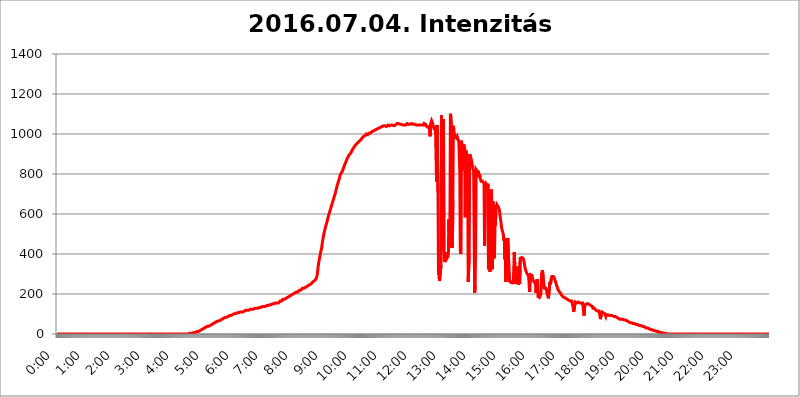
| Category | 2016.07.04. Intenzitás [W/m^2] |
|---|---|
| 0.0 | 0 |
| 0.0006944444444444445 | 0 |
| 0.001388888888888889 | 0 |
| 0.0020833333333333333 | 0 |
| 0.002777777777777778 | 0 |
| 0.003472222222222222 | 0 |
| 0.004166666666666667 | 0 |
| 0.004861111111111111 | 0 |
| 0.005555555555555556 | 0 |
| 0.0062499999999999995 | 0 |
| 0.006944444444444444 | 0 |
| 0.007638888888888889 | 0 |
| 0.008333333333333333 | 0 |
| 0.009027777777777779 | 0 |
| 0.009722222222222222 | 0 |
| 0.010416666666666666 | 0 |
| 0.011111111111111112 | 0 |
| 0.011805555555555555 | 0 |
| 0.012499999999999999 | 0 |
| 0.013194444444444444 | 0 |
| 0.013888888888888888 | 0 |
| 0.014583333333333332 | 0 |
| 0.015277777777777777 | 0 |
| 0.015972222222222224 | 0 |
| 0.016666666666666666 | 0 |
| 0.017361111111111112 | 0 |
| 0.018055555555555557 | 0 |
| 0.01875 | 0 |
| 0.019444444444444445 | 0 |
| 0.02013888888888889 | 0 |
| 0.020833333333333332 | 0 |
| 0.02152777777777778 | 0 |
| 0.022222222222222223 | 0 |
| 0.02291666666666667 | 0 |
| 0.02361111111111111 | 0 |
| 0.024305555555555556 | 0 |
| 0.024999999999999998 | 0 |
| 0.025694444444444447 | 0 |
| 0.02638888888888889 | 0 |
| 0.027083333333333334 | 0 |
| 0.027777777777777776 | 0 |
| 0.02847222222222222 | 0 |
| 0.029166666666666664 | 0 |
| 0.029861111111111113 | 0 |
| 0.030555555555555555 | 0 |
| 0.03125 | 0 |
| 0.03194444444444445 | 0 |
| 0.03263888888888889 | 0 |
| 0.03333333333333333 | 0 |
| 0.034027777777777775 | 0 |
| 0.034722222222222224 | 0 |
| 0.035416666666666666 | 0 |
| 0.036111111111111115 | 0 |
| 0.03680555555555556 | 0 |
| 0.0375 | 0 |
| 0.03819444444444444 | 0 |
| 0.03888888888888889 | 0 |
| 0.03958333333333333 | 0 |
| 0.04027777777777778 | 0 |
| 0.04097222222222222 | 0 |
| 0.041666666666666664 | 0 |
| 0.042361111111111106 | 0 |
| 0.04305555555555556 | 0 |
| 0.043750000000000004 | 0 |
| 0.044444444444444446 | 0 |
| 0.04513888888888889 | 0 |
| 0.04583333333333334 | 0 |
| 0.04652777777777778 | 0 |
| 0.04722222222222222 | 0 |
| 0.04791666666666666 | 0 |
| 0.04861111111111111 | 0 |
| 0.049305555555555554 | 0 |
| 0.049999999999999996 | 0 |
| 0.05069444444444445 | 0 |
| 0.051388888888888894 | 0 |
| 0.052083333333333336 | 0 |
| 0.05277777777777778 | 0 |
| 0.05347222222222222 | 0 |
| 0.05416666666666667 | 0 |
| 0.05486111111111111 | 0 |
| 0.05555555555555555 | 0 |
| 0.05625 | 0 |
| 0.05694444444444444 | 0 |
| 0.057638888888888885 | 0 |
| 0.05833333333333333 | 0 |
| 0.05902777777777778 | 0 |
| 0.059722222222222225 | 0 |
| 0.06041666666666667 | 0 |
| 0.061111111111111116 | 0 |
| 0.06180555555555556 | 0 |
| 0.0625 | 0 |
| 0.06319444444444444 | 0 |
| 0.06388888888888888 | 0 |
| 0.06458333333333334 | 0 |
| 0.06527777777777778 | 0 |
| 0.06597222222222222 | 0 |
| 0.06666666666666667 | 0 |
| 0.06736111111111111 | 0 |
| 0.06805555555555555 | 0 |
| 0.06874999999999999 | 0 |
| 0.06944444444444443 | 0 |
| 0.07013888888888889 | 0 |
| 0.07083333333333333 | 0 |
| 0.07152777777777779 | 0 |
| 0.07222222222222223 | 0 |
| 0.07291666666666667 | 0 |
| 0.07361111111111111 | 0 |
| 0.07430555555555556 | 0 |
| 0.075 | 0 |
| 0.07569444444444444 | 0 |
| 0.0763888888888889 | 0 |
| 0.07708333333333334 | 0 |
| 0.07777777777777778 | 0 |
| 0.07847222222222222 | 0 |
| 0.07916666666666666 | 0 |
| 0.0798611111111111 | 0 |
| 0.08055555555555556 | 0 |
| 0.08125 | 0 |
| 0.08194444444444444 | 0 |
| 0.08263888888888889 | 0 |
| 0.08333333333333333 | 0 |
| 0.08402777777777777 | 0 |
| 0.08472222222222221 | 0 |
| 0.08541666666666665 | 0 |
| 0.08611111111111112 | 0 |
| 0.08680555555555557 | 0 |
| 0.08750000000000001 | 0 |
| 0.08819444444444445 | 0 |
| 0.08888888888888889 | 0 |
| 0.08958333333333333 | 0 |
| 0.09027777777777778 | 0 |
| 0.09097222222222222 | 0 |
| 0.09166666666666667 | 0 |
| 0.09236111111111112 | 0 |
| 0.09305555555555556 | 0 |
| 0.09375 | 0 |
| 0.09444444444444444 | 0 |
| 0.09513888888888888 | 0 |
| 0.09583333333333333 | 0 |
| 0.09652777777777777 | 0 |
| 0.09722222222222222 | 0 |
| 0.09791666666666667 | 0 |
| 0.09861111111111111 | 0 |
| 0.09930555555555555 | 0 |
| 0.09999999999999999 | 0 |
| 0.10069444444444443 | 0 |
| 0.1013888888888889 | 0 |
| 0.10208333333333335 | 0 |
| 0.10277777777777779 | 0 |
| 0.10347222222222223 | 0 |
| 0.10416666666666667 | 0 |
| 0.10486111111111111 | 0 |
| 0.10555555555555556 | 0 |
| 0.10625 | 0 |
| 0.10694444444444444 | 0 |
| 0.1076388888888889 | 0 |
| 0.10833333333333334 | 0 |
| 0.10902777777777778 | 0 |
| 0.10972222222222222 | 0 |
| 0.1111111111111111 | 0 |
| 0.11180555555555556 | 0 |
| 0.11180555555555556 | 0 |
| 0.1125 | 0 |
| 0.11319444444444444 | 0 |
| 0.11388888888888889 | 0 |
| 0.11458333333333333 | 0 |
| 0.11527777777777777 | 0 |
| 0.11597222222222221 | 0 |
| 0.11666666666666665 | 0 |
| 0.1173611111111111 | 0 |
| 0.11805555555555557 | 0 |
| 0.11944444444444445 | 0 |
| 0.12013888888888889 | 0 |
| 0.12083333333333333 | 0 |
| 0.12152777777777778 | 0 |
| 0.12222222222222223 | 0 |
| 0.12291666666666667 | 0 |
| 0.12291666666666667 | 0 |
| 0.12361111111111112 | 0 |
| 0.12430555555555556 | 0 |
| 0.125 | 0 |
| 0.12569444444444444 | 0 |
| 0.12638888888888888 | 0 |
| 0.12708333333333333 | 0 |
| 0.16875 | 0 |
| 0.12847222222222224 | 0 |
| 0.12916666666666668 | 0 |
| 0.12986111111111112 | 0 |
| 0.13055555555555556 | 0 |
| 0.13125 | 0 |
| 0.13194444444444445 | 0 |
| 0.1326388888888889 | 0 |
| 0.13333333333333333 | 0 |
| 0.13402777777777777 | 0 |
| 0.13402777777777777 | 0 |
| 0.13472222222222222 | 0 |
| 0.13541666666666666 | 0 |
| 0.1361111111111111 | 0 |
| 0.13749999999999998 | 0 |
| 0.13819444444444443 | 0 |
| 0.1388888888888889 | 0 |
| 0.13958333333333334 | 0 |
| 0.14027777777777778 | 0 |
| 0.14097222222222222 | 0 |
| 0.14166666666666666 | 0 |
| 0.1423611111111111 | 0 |
| 0.14305555555555557 | 0 |
| 0.14375000000000002 | 0 |
| 0.14444444444444446 | 0 |
| 0.1451388888888889 | 0 |
| 0.1451388888888889 | 0 |
| 0.14652777777777778 | 0 |
| 0.14722222222222223 | 0 |
| 0.14791666666666667 | 0 |
| 0.1486111111111111 | 0 |
| 0.14930555555555555 | 0 |
| 0.15 | 0 |
| 0.15069444444444444 | 0 |
| 0.15138888888888888 | 0 |
| 0.15208333333333332 | 0 |
| 0.15277777777777776 | 0 |
| 0.15347222222222223 | 0 |
| 0.15416666666666667 | 0 |
| 0.15486111111111112 | 0 |
| 0.15555555555555556 | 0 |
| 0.15625 | 0 |
| 0.15694444444444444 | 0 |
| 0.15763888888888888 | 0 |
| 0.15833333333333333 | 0 |
| 0.15902777777777777 | 0 |
| 0.15972222222222224 | 0 |
| 0.16041666666666668 | 0 |
| 0.16111111111111112 | 0 |
| 0.16180555555555556 | 0 |
| 0.1625 | 0 |
| 0.16319444444444445 | 0 |
| 0.1638888888888889 | 0 |
| 0.16458333333333333 | 0 |
| 0.16527777777777777 | 0 |
| 0.16597222222222222 | 0 |
| 0.16666666666666666 | 0 |
| 0.1673611111111111 | 0 |
| 0.16805555555555554 | 0 |
| 0.16874999999999998 | 0 |
| 0.16944444444444443 | 0 |
| 0.17013888888888887 | 0 |
| 0.1708333333333333 | 0 |
| 0.17152777777777775 | 0 |
| 0.17222222222222225 | 0 |
| 0.1729166666666667 | 0 |
| 0.17361111111111113 | 0 |
| 0.17430555555555557 | 0 |
| 0.17500000000000002 | 0 |
| 0.17569444444444446 | 0 |
| 0.1763888888888889 | 0 |
| 0.17708333333333334 | 0 |
| 0.17777777777777778 | 0 |
| 0.17847222222222223 | 0 |
| 0.17916666666666667 | 0 |
| 0.1798611111111111 | 0 |
| 0.18055555555555555 | 0 |
| 0.18125 | 0 |
| 0.18194444444444444 | 0 |
| 0.1826388888888889 | 0 |
| 0.18333333333333335 | 0 |
| 0.1840277777777778 | 0 |
| 0.18472222222222223 | 0 |
| 0.18541666666666667 | 3.525 |
| 0.18611111111111112 | 3.525 |
| 0.18680555555555556 | 3.525 |
| 0.1875 | 3.525 |
| 0.18819444444444444 | 3.525 |
| 0.18888888888888888 | 3.525 |
| 0.18958333333333333 | 3.525 |
| 0.19027777777777777 | 3.525 |
| 0.1909722222222222 | 3.525 |
| 0.19166666666666665 | 7.887 |
| 0.19236111111111112 | 7.887 |
| 0.19305555555555554 | 7.887 |
| 0.19375 | 7.887 |
| 0.19444444444444445 | 7.887 |
| 0.1951388888888889 | 12.257 |
| 0.19583333333333333 | 12.257 |
| 0.19652777777777777 | 12.257 |
| 0.19722222222222222 | 12.257 |
| 0.19791666666666666 | 12.257 |
| 0.1986111111111111 | 16.636 |
| 0.19930555555555554 | 16.636 |
| 0.19999999999999998 | 16.636 |
| 0.20069444444444443 | 21.024 |
| 0.20138888888888887 | 21.024 |
| 0.2020833333333333 | 21.024 |
| 0.2027777777777778 | 25.419 |
| 0.2034722222222222 | 25.419 |
| 0.2041666666666667 | 25.419 |
| 0.20486111111111113 | 29.823 |
| 0.20555555555555557 | 29.823 |
| 0.20625000000000002 | 29.823 |
| 0.20694444444444446 | 29.823 |
| 0.2076388888888889 | 29.823 |
| 0.20833333333333334 | 34.234 |
| 0.20902777777777778 | 34.234 |
| 0.20972222222222223 | 38.653 |
| 0.21041666666666667 | 38.653 |
| 0.2111111111111111 | 38.653 |
| 0.21180555555555555 | 38.653 |
| 0.2125 | 38.653 |
| 0.21319444444444444 | 43.079 |
| 0.2138888888888889 | 43.079 |
| 0.21458333333333335 | 43.079 |
| 0.2152777777777778 | 47.511 |
| 0.21597222222222223 | 47.511 |
| 0.21666666666666667 | 47.511 |
| 0.21736111111111112 | 47.511 |
| 0.21805555555555556 | 51.951 |
| 0.21875 | 51.951 |
| 0.21944444444444444 | 51.951 |
| 0.22013888888888888 | 56.398 |
| 0.22083333333333333 | 56.398 |
| 0.22152777777777777 | 56.398 |
| 0.2222222222222222 | 56.398 |
| 0.22291666666666665 | 60.85 |
| 0.2236111111111111 | 60.85 |
| 0.22430555555555556 | 60.85 |
| 0.225 | 65.31 |
| 0.22569444444444445 | 65.31 |
| 0.2263888888888889 | 65.31 |
| 0.22708333333333333 | 65.31 |
| 0.22777777777777777 | 69.775 |
| 0.22847222222222222 | 69.775 |
| 0.22916666666666666 | 69.775 |
| 0.2298611111111111 | 74.246 |
| 0.23055555555555554 | 74.246 |
| 0.23124999999999998 | 74.246 |
| 0.23194444444444443 | 74.246 |
| 0.23263888888888887 | 78.722 |
| 0.2333333333333333 | 78.722 |
| 0.2340277777777778 | 78.722 |
| 0.2347222222222222 | 83.205 |
| 0.2354166666666667 | 83.205 |
| 0.23611111111111113 | 83.205 |
| 0.23680555555555557 | 83.205 |
| 0.23750000000000002 | 83.205 |
| 0.23819444444444446 | 87.692 |
| 0.2388888888888889 | 87.692 |
| 0.23958333333333334 | 87.692 |
| 0.24027777777777778 | 87.692 |
| 0.24097222222222223 | 92.184 |
| 0.24166666666666667 | 92.184 |
| 0.2423611111111111 | 92.184 |
| 0.24305555555555555 | 92.184 |
| 0.24375 | 92.184 |
| 0.24444444444444446 | 92.184 |
| 0.24513888888888888 | 96.682 |
| 0.24583333333333335 | 96.682 |
| 0.2465277777777778 | 96.682 |
| 0.24722222222222223 | 96.682 |
| 0.24791666666666667 | 101.184 |
| 0.24861111111111112 | 101.184 |
| 0.24930555555555556 | 101.184 |
| 0.25 | 101.184 |
| 0.25069444444444444 | 101.184 |
| 0.2513888888888889 | 101.184 |
| 0.2520833333333333 | 105.69 |
| 0.25277777777777777 | 105.69 |
| 0.2534722222222222 | 105.69 |
| 0.25416666666666665 | 105.69 |
| 0.2548611111111111 | 105.69 |
| 0.2555555555555556 | 110.201 |
| 0.25625000000000003 | 110.201 |
| 0.2569444444444445 | 110.201 |
| 0.2576388888888889 | 110.201 |
| 0.25833333333333336 | 110.201 |
| 0.2590277777777778 | 110.201 |
| 0.25972222222222224 | 110.201 |
| 0.2604166666666667 | 110.201 |
| 0.2611111111111111 | 114.716 |
| 0.26180555555555557 | 114.716 |
| 0.2625 | 114.716 |
| 0.26319444444444445 | 114.716 |
| 0.2638888888888889 | 114.716 |
| 0.26458333333333334 | 119.235 |
| 0.2652777777777778 | 114.716 |
| 0.2659722222222222 | 119.235 |
| 0.26666666666666666 | 119.235 |
| 0.2673611111111111 | 119.235 |
| 0.26805555555555555 | 119.235 |
| 0.26875 | 119.235 |
| 0.26944444444444443 | 119.235 |
| 0.2701388888888889 | 119.235 |
| 0.2708333333333333 | 123.758 |
| 0.27152777777777776 | 123.758 |
| 0.2722222222222222 | 123.758 |
| 0.27291666666666664 | 123.758 |
| 0.2736111111111111 | 123.758 |
| 0.2743055555555555 | 123.758 |
| 0.27499999999999997 | 123.758 |
| 0.27569444444444446 | 128.284 |
| 0.27638888888888885 | 128.284 |
| 0.27708333333333335 | 128.284 |
| 0.2777777777777778 | 128.284 |
| 0.27847222222222223 | 128.284 |
| 0.2791666666666667 | 128.284 |
| 0.2798611111111111 | 128.284 |
| 0.28055555555555556 | 128.284 |
| 0.28125 | 128.284 |
| 0.28194444444444444 | 132.814 |
| 0.2826388888888889 | 132.814 |
| 0.2833333333333333 | 132.814 |
| 0.28402777777777777 | 132.814 |
| 0.2847222222222222 | 132.814 |
| 0.28541666666666665 | 132.814 |
| 0.28611111111111115 | 137.347 |
| 0.28680555555555554 | 137.347 |
| 0.28750000000000003 | 137.347 |
| 0.2881944444444445 | 137.347 |
| 0.2888888888888889 | 137.347 |
| 0.28958333333333336 | 137.347 |
| 0.2902777777777778 | 137.347 |
| 0.29097222222222224 | 137.347 |
| 0.2916666666666667 | 137.347 |
| 0.2923611111111111 | 141.884 |
| 0.29305555555555557 | 141.884 |
| 0.29375 | 141.884 |
| 0.29444444444444445 | 141.884 |
| 0.2951388888888889 | 141.884 |
| 0.29583333333333334 | 141.884 |
| 0.2965277777777778 | 146.423 |
| 0.2972222222222222 | 146.423 |
| 0.29791666666666666 | 146.423 |
| 0.2986111111111111 | 146.423 |
| 0.29930555555555555 | 146.423 |
| 0.3 | 146.423 |
| 0.30069444444444443 | 146.423 |
| 0.3013888888888889 | 150.964 |
| 0.3020833333333333 | 150.964 |
| 0.30277777777777776 | 150.964 |
| 0.3034722222222222 | 150.964 |
| 0.30416666666666664 | 150.964 |
| 0.3048611111111111 | 150.964 |
| 0.3055555555555555 | 155.509 |
| 0.30624999999999997 | 155.509 |
| 0.3069444444444444 | 155.509 |
| 0.3076388888888889 | 155.509 |
| 0.30833333333333335 | 155.509 |
| 0.3090277777777778 | 155.509 |
| 0.30972222222222223 | 155.509 |
| 0.3104166666666667 | 155.509 |
| 0.3111111111111111 | 160.056 |
| 0.31180555555555556 | 160.056 |
| 0.3125 | 164.605 |
| 0.31319444444444444 | 164.605 |
| 0.3138888888888889 | 164.605 |
| 0.3145833333333333 | 164.605 |
| 0.31527777777777777 | 169.156 |
| 0.3159722222222222 | 169.156 |
| 0.31666666666666665 | 173.709 |
| 0.31736111111111115 | 173.709 |
| 0.31805555555555554 | 173.709 |
| 0.31875000000000003 | 173.709 |
| 0.3194444444444445 | 178.264 |
| 0.3201388888888889 | 178.264 |
| 0.32083333333333336 | 178.264 |
| 0.3215277777777778 | 182.82 |
| 0.32222222222222224 | 182.82 |
| 0.3229166666666667 | 182.82 |
| 0.3236111111111111 | 182.82 |
| 0.32430555555555557 | 187.378 |
| 0.325 | 187.378 |
| 0.32569444444444445 | 187.378 |
| 0.3263888888888889 | 191.937 |
| 0.32708333333333334 | 191.937 |
| 0.3277777777777778 | 191.937 |
| 0.3284722222222222 | 196.497 |
| 0.32916666666666666 | 196.497 |
| 0.3298611111111111 | 196.497 |
| 0.33055555555555555 | 201.058 |
| 0.33125 | 201.058 |
| 0.33194444444444443 | 201.058 |
| 0.3326388888888889 | 201.058 |
| 0.3333333333333333 | 205.62 |
| 0.3340277777777778 | 205.62 |
| 0.3347222222222222 | 205.62 |
| 0.3354166666666667 | 210.182 |
| 0.3361111111111111 | 210.182 |
| 0.3368055555555556 | 210.182 |
| 0.33749999999999997 | 210.182 |
| 0.33819444444444446 | 214.746 |
| 0.33888888888888885 | 214.746 |
| 0.33958333333333335 | 219.309 |
| 0.34027777777777773 | 219.309 |
| 0.34097222222222223 | 219.309 |
| 0.3416666666666666 | 219.309 |
| 0.3423611111111111 | 223.873 |
| 0.3430555555555555 | 223.873 |
| 0.34375 | 228.436 |
| 0.3444444444444445 | 228.436 |
| 0.3451388888888889 | 228.436 |
| 0.3458333333333334 | 228.436 |
| 0.34652777777777777 | 233 |
| 0.34722222222222227 | 233 |
| 0.34791666666666665 | 233 |
| 0.34861111111111115 | 233 |
| 0.34930555555555554 | 237.564 |
| 0.35000000000000003 | 237.564 |
| 0.3506944444444444 | 242.127 |
| 0.3513888888888889 | 242.127 |
| 0.3520833333333333 | 242.127 |
| 0.3527777777777778 | 246.689 |
| 0.3534722222222222 | 246.689 |
| 0.3541666666666667 | 246.689 |
| 0.3548611111111111 | 251.251 |
| 0.35555555555555557 | 251.251 |
| 0.35625 | 251.251 |
| 0.35694444444444445 | 255.813 |
| 0.3576388888888889 | 255.813 |
| 0.35833333333333334 | 260.373 |
| 0.3590277777777778 | 260.373 |
| 0.3597222222222222 | 264.932 |
| 0.36041666666666666 | 264.932 |
| 0.3611111111111111 | 269.49 |
| 0.36180555555555555 | 269.49 |
| 0.3625 | 274.047 |
| 0.36319444444444443 | 278.603 |
| 0.3638888888888889 | 283.156 |
| 0.3645833333333333 | 296.808 |
| 0.3652777777777778 | 314.98 |
| 0.3659722222222222 | 337.639 |
| 0.3666666666666667 | 355.712 |
| 0.3673611111111111 | 369.23 |
| 0.3680555555555556 | 382.715 |
| 0.36874999999999997 | 396.164 |
| 0.36944444444444446 | 409.574 |
| 0.37013888888888885 | 418.492 |
| 0.37083333333333335 | 431.833 |
| 0.37152777777777773 | 449.551 |
| 0.37222222222222223 | 467.187 |
| 0.3729166666666666 | 480.356 |
| 0.3736111111111111 | 493.475 |
| 0.3743055555555555 | 506.542 |
| 0.375 | 515.223 |
| 0.3756944444444445 | 528.2 |
| 0.3763888888888889 | 536.82 |
| 0.3770833333333334 | 545.416 |
| 0.37777777777777777 | 553.986 |
| 0.37847222222222227 | 562.53 |
| 0.37916666666666665 | 575.299 |
| 0.37986111111111115 | 583.779 |
| 0.38055555555555554 | 592.233 |
| 0.38125000000000003 | 600.661 |
| 0.3819444444444444 | 609.062 |
| 0.3826388888888889 | 617.436 |
| 0.3833333333333333 | 625.784 |
| 0.3840277777777778 | 634.105 |
| 0.3847222222222222 | 642.4 |
| 0.3854166666666667 | 650.667 |
| 0.3861111111111111 | 658.909 |
| 0.38680555555555557 | 667.123 |
| 0.3875 | 675.311 |
| 0.38819444444444445 | 683.473 |
| 0.3888888888888889 | 691.608 |
| 0.38958333333333334 | 699.717 |
| 0.3902777777777778 | 707.8 |
| 0.3909722222222222 | 719.877 |
| 0.39166666666666666 | 727.896 |
| 0.3923611111111111 | 739.877 |
| 0.39305555555555555 | 747.834 |
| 0.39375 | 751.803 |
| 0.39444444444444443 | 763.674 |
| 0.3951388888888889 | 771.559 |
| 0.3958333333333333 | 779.42 |
| 0.3965277777777778 | 791.169 |
| 0.3972222222222222 | 798.974 |
| 0.3979166666666667 | 802.868 |
| 0.3986111111111111 | 806.757 |
| 0.3993055555555556 | 810.641 |
| 0.39999999999999997 | 814.519 |
| 0.40069444444444446 | 822.26 |
| 0.40138888888888885 | 829.981 |
| 0.40208333333333335 | 833.834 |
| 0.40277777777777773 | 841.526 |
| 0.40347222222222223 | 849.199 |
| 0.4041666666666666 | 853.029 |
| 0.4048611111111111 | 860.676 |
| 0.4055555555555555 | 868.305 |
| 0.40625 | 872.114 |
| 0.4069444444444445 | 879.719 |
| 0.4076388888888889 | 883.516 |
| 0.4083333333333334 | 887.309 |
| 0.40902777777777777 | 894.885 |
| 0.40972222222222227 | 894.885 |
| 0.41041666666666665 | 898.668 |
| 0.41111111111111115 | 902.447 |
| 0.41180555555555554 | 906.223 |
| 0.41250000000000003 | 909.996 |
| 0.4131944444444444 | 913.766 |
| 0.4138888888888889 | 921.298 |
| 0.4145833333333333 | 925.06 |
| 0.4152777777777778 | 928.819 |
| 0.4159722222222222 | 932.576 |
| 0.4166666666666667 | 936.33 |
| 0.4173611111111111 | 940.082 |
| 0.41805555555555557 | 943.832 |
| 0.41875 | 947.58 |
| 0.41944444444444445 | 947.58 |
| 0.4201388888888889 | 951.327 |
| 0.42083333333333334 | 955.071 |
| 0.4215277777777778 | 955.071 |
| 0.4222222222222222 | 958.814 |
| 0.42291666666666666 | 962.555 |
| 0.4236111111111111 | 962.555 |
| 0.42430555555555555 | 966.295 |
| 0.425 | 970.034 |
| 0.42569444444444443 | 970.034 |
| 0.4263888888888889 | 973.772 |
| 0.4270833333333333 | 977.508 |
| 0.4277777777777778 | 981.244 |
| 0.4284722222222222 | 981.244 |
| 0.4291666666666667 | 984.98 |
| 0.4298611111111111 | 988.714 |
| 0.4305555555555556 | 988.714 |
| 0.43124999999999997 | 992.448 |
| 0.43194444444444446 | 992.448 |
| 0.43263888888888885 | 996.182 |
| 0.43333333333333335 | 999.916 |
| 0.43402777777777773 | 996.182 |
| 0.43472222222222223 | 996.182 |
| 0.4354166666666666 | 996.182 |
| 0.4361111111111111 | 999.916 |
| 0.4368055555555555 | 1003.65 |
| 0.4375 | 1003.65 |
| 0.4381944444444445 | 1003.65 |
| 0.4388888888888889 | 1003.65 |
| 0.4395833333333334 | 1007.383 |
| 0.44027777777777777 | 1007.383 |
| 0.44097222222222227 | 1011.118 |
| 0.44166666666666665 | 1011.118 |
| 0.44236111111111115 | 1014.852 |
| 0.44305555555555554 | 1014.852 |
| 0.44375000000000003 | 1018.587 |
| 0.4444444444444444 | 1018.587 |
| 0.4451388888888889 | 1018.587 |
| 0.4458333333333333 | 1018.587 |
| 0.4465277777777778 | 1022.323 |
| 0.4472222222222222 | 1022.323 |
| 0.4479166666666667 | 1022.323 |
| 0.4486111111111111 | 1022.323 |
| 0.44930555555555557 | 1026.06 |
| 0.45 | 1026.06 |
| 0.45069444444444445 | 1029.798 |
| 0.4513888888888889 | 1029.798 |
| 0.45208333333333334 | 1033.537 |
| 0.4527777777777778 | 1033.537 |
| 0.4534722222222222 | 1033.537 |
| 0.45416666666666666 | 1037.277 |
| 0.4548611111111111 | 1037.277 |
| 0.45555555555555555 | 1037.277 |
| 0.45625 | 1037.277 |
| 0.45694444444444443 | 1037.277 |
| 0.4576388888888889 | 1041.019 |
| 0.4583333333333333 | 1044.762 |
| 0.4590277777777778 | 1041.019 |
| 0.4597222222222222 | 1041.019 |
| 0.4604166666666667 | 1041.019 |
| 0.4611111111111111 | 1037.277 |
| 0.4618055555555556 | 1037.277 |
| 0.46249999999999997 | 1037.277 |
| 0.46319444444444446 | 1041.019 |
| 0.46388888888888885 | 1044.762 |
| 0.46458333333333335 | 1041.019 |
| 0.46527777777777773 | 1041.019 |
| 0.46597222222222223 | 1041.019 |
| 0.4666666666666666 | 1041.019 |
| 0.4673611111111111 | 1044.762 |
| 0.4680555555555555 | 1044.762 |
| 0.46875 | 1041.019 |
| 0.4694444444444445 | 1041.019 |
| 0.4701388888888889 | 1044.762 |
| 0.4708333333333334 | 1044.762 |
| 0.47152777777777777 | 1044.762 |
| 0.47222222222222227 | 1041.019 |
| 0.47291666666666665 | 1037.277 |
| 0.47361111111111115 | 1044.762 |
| 0.47430555555555554 | 1044.762 |
| 0.47500000000000003 | 1044.762 |
| 0.4756944444444444 | 1048.508 |
| 0.4763888888888889 | 1052.255 |
| 0.4770833333333333 | 1052.255 |
| 0.4777777777777778 | 1052.255 |
| 0.4784722222222222 | 1052.255 |
| 0.4791666666666667 | 1052.255 |
| 0.4798611111111111 | 1048.508 |
| 0.48055555555555557 | 1048.508 |
| 0.48125 | 1048.508 |
| 0.48194444444444445 | 1048.508 |
| 0.4826388888888889 | 1048.508 |
| 0.48333333333333334 | 1048.508 |
| 0.4840277777777778 | 1048.508 |
| 0.4847222222222222 | 1044.762 |
| 0.48541666666666666 | 1044.762 |
| 0.4861111111111111 | 1044.762 |
| 0.48680555555555555 | 1044.762 |
| 0.4875 | 1044.762 |
| 0.48819444444444443 | 1048.508 |
| 0.4888888888888889 | 1044.762 |
| 0.4895833333333333 | 1048.508 |
| 0.4902777777777778 | 1048.508 |
| 0.4909722222222222 | 1052.255 |
| 0.4916666666666667 | 1048.508 |
| 0.4923611111111111 | 1052.255 |
| 0.4930555555555556 | 1048.508 |
| 0.49374999999999997 | 1048.508 |
| 0.49444444444444446 | 1052.255 |
| 0.49513888888888885 | 1048.508 |
| 0.49583333333333335 | 1048.508 |
| 0.49652777777777773 | 1052.255 |
| 0.49722222222222223 | 1052.255 |
| 0.4979166666666666 | 1048.508 |
| 0.4986111111111111 | 1048.508 |
| 0.4993055555555555 | 1048.508 |
| 0.5 | 1048.508 |
| 0.5006944444444444 | 1048.508 |
| 0.5013888888888889 | 1048.508 |
| 0.5020833333333333 | 1048.508 |
| 0.5027777777777778 | 1044.762 |
| 0.5034722222222222 | 1044.762 |
| 0.5041666666666667 | 1044.762 |
| 0.5048611111111111 | 1044.762 |
| 0.5055555555555555 | 1044.762 |
| 0.50625 | 1044.762 |
| 0.5069444444444444 | 1048.508 |
| 0.5076388888888889 | 1044.762 |
| 0.5083333333333333 | 1044.762 |
| 0.5090277777777777 | 1044.762 |
| 0.5097222222222222 | 1044.762 |
| 0.5104166666666666 | 1044.762 |
| 0.5111111111111112 | 1048.508 |
| 0.5118055555555555 | 1044.762 |
| 0.5125000000000001 | 1044.762 |
| 0.5131944444444444 | 1044.762 |
| 0.513888888888889 | 1044.762 |
| 0.5145833333333333 | 1052.255 |
| 0.5152777777777778 | 1048.508 |
| 0.5159722222222222 | 1048.508 |
| 0.5166666666666667 | 1048.508 |
| 0.517361111111111 | 1041.019 |
| 0.5180555555555556 | 1041.019 |
| 0.5187499999999999 | 1037.277 |
| 0.5194444444444445 | 1033.537 |
| 0.5201388888888888 | 1037.277 |
| 0.5208333333333334 | 1033.537 |
| 0.5215277777777778 | 1033.537 |
| 0.5222222222222223 | 1041.019 |
| 0.5229166666666667 | 988.714 |
| 0.5236111111111111 | 1048.508 |
| 0.5243055555555556 | 1059.756 |
| 0.525 | 1067.267 |
| 0.5256944444444445 | 1067.267 |
| 0.5263888888888889 | 1056.004 |
| 0.5270833333333333 | 1044.762 |
| 0.5277777777777778 | 1033.537 |
| 0.5284722222222222 | 1026.06 |
| 0.5291666666666667 | 1026.06 |
| 0.5298611111111111 | 1022.323 |
| 0.5305555555555556 | 1026.06 |
| 0.53125 | 1026.06 |
| 0.5319444444444444 | 759.723 |
| 0.5326388888888889 | 1044.762 |
| 0.5333333333333333 | 1044.762 |
| 0.5340277777777778 | 707.8 |
| 0.5347222222222222 | 296.808 |
| 0.5354166666666667 | 310.44 |
| 0.5361111111111111 | 264.932 |
| 0.5368055555555555 | 260.373 |
| 0.5375 | 260.373 |
| 0.5381944444444444 | 342.162 |
| 0.5388888888888889 | 1093.653 |
| 0.5395833333333333 | 829.981 |
| 0.5402777777777777 | 409.574 |
| 0.5409722222222222 | 853.029 |
| 0.5416666666666666 | 1074.789 |
| 0.5423611111111112 | 418.492 |
| 0.5430555555555555 | 360.221 |
| 0.5437500000000001 | 369.23 |
| 0.5444444444444444 | 382.715 |
| 0.545138888888889 | 409.574 |
| 0.5458333333333333 | 400.638 |
| 0.5465277777777778 | 378.224 |
| 0.5472222222222222 | 382.715 |
| 0.5479166666666667 | 387.202 |
| 0.548611111111111 | 409.574 |
| 0.5493055555555556 | 575.299 |
| 0.5499999999999999 | 431.833 |
| 0.5506944444444445 | 480.356 |
| 0.5513888888888888 | 1101.226 |
| 0.5520833333333334 | 1086.097 |
| 0.5527777777777778 | 1059.756 |
| 0.5534722222222223 | 493.475 |
| 0.5541666666666667 | 431.833 |
| 0.5548611111111111 | 667.123 |
| 0.5555555555555556 | 1041.019 |
| 0.55625 | 1018.587 |
| 0.5569444444444445 | 1003.65 |
| 0.5576388888888889 | 992.448 |
| 0.5583333333333333 | 984.98 |
| 0.5590277777777778 | 984.98 |
| 0.5597222222222222 | 984.98 |
| 0.5604166666666667 | 977.508 |
| 0.5611111111111111 | 984.98 |
| 0.5618055555555556 | 977.508 |
| 0.5625 | 970.034 |
| 0.5631944444444444 | 962.555 |
| 0.5638888888888889 | 962.555 |
| 0.5645833333333333 | 806.757 |
| 0.5652777777777778 | 418.492 |
| 0.5659722222222222 | 400.638 |
| 0.5666666666666667 | 966.295 |
| 0.5673611111111111 | 962.555 |
| 0.5680555555555555 | 936.33 |
| 0.56875 | 814.519 |
| 0.5694444444444444 | 932.576 |
| 0.5701388888888889 | 947.58 |
| 0.5708333333333333 | 936.33 |
| 0.5715277777777777 | 928.819 |
| 0.5722222222222222 | 583.779 |
| 0.5729166666666666 | 917.534 |
| 0.5736111111111112 | 909.996 |
| 0.5743055555555555 | 902.447 |
| 0.5750000000000001 | 898.668 |
| 0.5756944444444444 | 822.26 |
| 0.576388888888889 | 260.373 |
| 0.5770833333333333 | 264.932 |
| 0.5777777777777778 | 396.164 |
| 0.5784722222222222 | 898.668 |
| 0.5791666666666667 | 891.099 |
| 0.579861111111111 | 883.516 |
| 0.5805555555555556 | 875.918 |
| 0.5812499999999999 | 860.676 |
| 0.5819444444444445 | 845.365 |
| 0.5826388888888888 | 833.834 |
| 0.5833333333333334 | 822.26 |
| 0.5840277777777778 | 814.519 |
| 0.5847222222222223 | 810.641 |
| 0.5854166666666667 | 205.62 |
| 0.5861111111111111 | 242.127 |
| 0.5868055555555556 | 462.786 |
| 0.5875 | 822.26 |
| 0.5881944444444445 | 818.392 |
| 0.5888888888888889 | 814.519 |
| 0.5895833333333333 | 814.519 |
| 0.5902777777777778 | 814.519 |
| 0.5909722222222222 | 810.641 |
| 0.5916666666666667 | 783.342 |
| 0.5923611111111111 | 798.974 |
| 0.5930555555555556 | 783.342 |
| 0.59375 | 771.559 |
| 0.5944444444444444 | 763.674 |
| 0.5951388888888889 | 759.723 |
| 0.5958333333333333 | 759.723 |
| 0.5965277777777778 | 763.674 |
| 0.5972222222222222 | 759.723 |
| 0.5979166666666667 | 767.62 |
| 0.5986111111111111 | 751.803 |
| 0.5993055555555555 | 440.702 |
| 0.6 | 695.666 |
| 0.6006944444444444 | 743.859 |
| 0.6013888888888889 | 751.803 |
| 0.6020833333333333 | 751.803 |
| 0.6027777777777777 | 747.834 |
| 0.6034722222222222 | 739.877 |
| 0.6041666666666666 | 751.803 |
| 0.6048611111111112 | 324.052 |
| 0.6055555555555555 | 679.395 |
| 0.6062500000000001 | 369.23 |
| 0.6069444444444444 | 310.44 |
| 0.607638888888889 | 646.537 |
| 0.6083333333333333 | 723.889 |
| 0.6090277777777778 | 711.832 |
| 0.6097222222222222 | 707.8 |
| 0.6104166666666667 | 324.052 |
| 0.611111111111111 | 663.019 |
| 0.6118055555555556 | 658.909 |
| 0.6124999999999999 | 462.786 |
| 0.6131944444444445 | 378.224 |
| 0.6138888888888888 | 621.613 |
| 0.6145833333333334 | 541.121 |
| 0.6152777777777778 | 642.4 |
| 0.6159722222222223 | 634.105 |
| 0.6166666666666667 | 646.537 |
| 0.6173611111111111 | 646.537 |
| 0.6180555555555556 | 642.4 |
| 0.61875 | 634.105 |
| 0.6194444444444445 | 625.784 |
| 0.6201388888888889 | 617.436 |
| 0.6208333333333333 | 600.661 |
| 0.6215277777777778 | 579.542 |
| 0.6222222222222222 | 562.53 |
| 0.6229166666666667 | 541.121 |
| 0.6236111111111111 | 523.88 |
| 0.6243055555555556 | 515.223 |
| 0.625 | 506.542 |
| 0.6256944444444444 | 497.836 |
| 0.6263888888888889 | 467.187 |
| 0.6270833333333333 | 480.356 |
| 0.6277777777777778 | 373.729 |
| 0.6284722222222222 | 467.187 |
| 0.6291666666666667 | 260.373 |
| 0.6298611111111111 | 396.164 |
| 0.6305555555555555 | 292.259 |
| 0.63125 | 467.187 |
| 0.6319444444444444 | 480.356 |
| 0.6326388888888889 | 484.735 |
| 0.6333333333333333 | 480.356 |
| 0.6340277777777777 | 260.373 |
| 0.6347222222222222 | 269.49 |
| 0.6354166666666666 | 260.373 |
| 0.6361111111111112 | 260.373 |
| 0.6368055555555555 | 260.373 |
| 0.6375000000000001 | 255.813 |
| 0.6381944444444444 | 260.373 |
| 0.638888888888889 | 260.373 |
| 0.6395833333333333 | 255.813 |
| 0.6402777777777778 | 324.052 |
| 0.6409722222222222 | 409.574 |
| 0.6416666666666667 | 342.162 |
| 0.642361111111111 | 278.603 |
| 0.6430555555555556 | 260.373 |
| 0.6437499999999999 | 251.251 |
| 0.6444444444444445 | 264.932 |
| 0.6451388888888888 | 337.639 |
| 0.6458333333333334 | 260.373 |
| 0.6465277777777778 | 246.689 |
| 0.6472222222222223 | 246.689 |
| 0.6479166666666667 | 264.932 |
| 0.6486111111111111 | 251.251 |
| 0.6493055555555556 | 378.224 |
| 0.65 | 373.729 |
| 0.6506944444444445 | 382.715 |
| 0.6513888888888889 | 382.715 |
| 0.6520833333333333 | 387.202 |
| 0.6527777777777778 | 382.715 |
| 0.6534722222222222 | 378.224 |
| 0.6541666666666667 | 369.23 |
| 0.6548611111111111 | 360.221 |
| 0.6555555555555556 | 342.162 |
| 0.65625 | 328.584 |
| 0.6569444444444444 | 319.517 |
| 0.6576388888888889 | 314.98 |
| 0.6583333333333333 | 305.898 |
| 0.6590277777777778 | 301.354 |
| 0.6597222222222222 | 296.808 |
| 0.6604166666666667 | 292.259 |
| 0.6611111111111111 | 287.709 |
| 0.6618055555555555 | 292.259 |
| 0.6625 | 210.182 |
| 0.6631944444444444 | 283.156 |
| 0.6638888888888889 | 296.808 |
| 0.6645833333333333 | 296.808 |
| 0.6652777777777777 | 296.808 |
| 0.6659722222222222 | 292.259 |
| 0.6666666666666666 | 278.603 |
| 0.6673611111111111 | 269.49 |
| 0.6680555555555556 | 264.932 |
| 0.6687500000000001 | 260.373 |
| 0.6694444444444444 | 255.813 |
| 0.6701388888888888 | 260.373 |
| 0.6708333333333334 | 251.251 |
| 0.6715277777777778 | 205.62 |
| 0.6722222222222222 | 260.373 |
| 0.6729166666666666 | 274.047 |
| 0.6736111111111112 | 264.932 |
| 0.6743055555555556 | 187.378 |
| 0.6749999999999999 | 187.378 |
| 0.6756944444444444 | 182.82 |
| 0.6763888888888889 | 182.82 |
| 0.6770833333333334 | 182.82 |
| 0.6777777777777777 | 187.378 |
| 0.6784722222222223 | 201.058 |
| 0.6791666666666667 | 296.808 |
| 0.6798611111111111 | 310.44 |
| 0.6805555555555555 | 319.517 |
| 0.68125 | 314.98 |
| 0.6819444444444445 | 314.98 |
| 0.6826388888888889 | 237.564 |
| 0.6833333333333332 | 228.436 |
| 0.6840277777777778 | 228.436 |
| 0.6847222222222222 | 228.436 |
| 0.6854166666666667 | 228.436 |
| 0.686111111111111 | 219.309 |
| 0.6868055555555556 | 205.62 |
| 0.6875 | 196.497 |
| 0.6881944444444444 | 187.378 |
| 0.688888888888889 | 178.264 |
| 0.6895833333333333 | 178.264 |
| 0.6902777777777778 | 178.264 |
| 0.6909722222222222 | 260.373 |
| 0.6916666666666668 | 246.689 |
| 0.6923611111111111 | 251.251 |
| 0.6930555555555555 | 278.603 |
| 0.69375 | 287.709 |
| 0.6944444444444445 | 292.259 |
| 0.6951388888888889 | 292.259 |
| 0.6958333333333333 | 287.709 |
| 0.6965277777777777 | 287.709 |
| 0.6972222222222223 | 278.603 |
| 0.6979166666666666 | 274.047 |
| 0.6986111111111111 | 264.932 |
| 0.6993055555555556 | 255.813 |
| 0.7000000000000001 | 246.689 |
| 0.7006944444444444 | 242.127 |
| 0.7013888888888888 | 233 |
| 0.7020833333333334 | 223.873 |
| 0.7027777777777778 | 219.309 |
| 0.7034722222222222 | 214.746 |
| 0.7041666666666666 | 210.182 |
| 0.7048611111111112 | 210.182 |
| 0.7055555555555556 | 205.62 |
| 0.7062499999999999 | 201.058 |
| 0.7069444444444444 | 196.497 |
| 0.7076388888888889 | 191.937 |
| 0.7083333333333334 | 191.937 |
| 0.7090277777777777 | 187.378 |
| 0.7097222222222223 | 182.82 |
| 0.7104166666666667 | 182.82 |
| 0.7111111111111111 | 182.82 |
| 0.7118055555555555 | 178.264 |
| 0.7125 | 178.264 |
| 0.7131944444444445 | 178.264 |
| 0.7138888888888889 | 173.709 |
| 0.7145833333333332 | 173.709 |
| 0.7152777777777778 | 173.709 |
| 0.7159722222222222 | 169.156 |
| 0.7166666666666667 | 169.156 |
| 0.717361111111111 | 169.156 |
| 0.7180555555555556 | 169.156 |
| 0.71875 | 164.605 |
| 0.7194444444444444 | 164.605 |
| 0.720138888888889 | 164.605 |
| 0.7208333333333333 | 164.605 |
| 0.7215277777777778 | 164.605 |
| 0.7222222222222222 | 164.605 |
| 0.7229166666666668 | 164.605 |
| 0.7236111111111111 | 132.814 |
| 0.7243055555555555 | 110.201 |
| 0.725 | 110.201 |
| 0.7256944444444445 | 141.884 |
| 0.7263888888888889 | 160.056 |
| 0.7270833333333333 | 160.056 |
| 0.7277777777777777 | 160.056 |
| 0.7284722222222223 | 155.509 |
| 0.7291666666666666 | 155.509 |
| 0.7298611111111111 | 160.056 |
| 0.7305555555555556 | 160.056 |
| 0.7312500000000001 | 160.056 |
| 0.7319444444444444 | 155.509 |
| 0.7326388888888888 | 155.509 |
| 0.7333333333333334 | 155.509 |
| 0.7340277777777778 | 155.509 |
| 0.7347222222222222 | 155.509 |
| 0.7354166666666666 | 155.509 |
| 0.7361111111111112 | 155.509 |
| 0.7368055555555556 | 155.509 |
| 0.7374999999999999 | 150.964 |
| 0.7381944444444444 | 150.964 |
| 0.7388888888888889 | 92.184 |
| 0.7395833333333334 | 128.284 |
| 0.7402777777777777 | 146.423 |
| 0.7409722222222223 | 146.423 |
| 0.7416666666666667 | 150.964 |
| 0.7423611111111111 | 150.964 |
| 0.7430555555555555 | 150.964 |
| 0.74375 | 150.964 |
| 0.7444444444444445 | 150.964 |
| 0.7451388888888889 | 155.509 |
| 0.7458333333333332 | 150.964 |
| 0.7465277777777778 | 146.423 |
| 0.7472222222222222 | 146.423 |
| 0.7479166666666667 | 146.423 |
| 0.748611111111111 | 141.884 |
| 0.7493055555555556 | 141.884 |
| 0.75 | 137.347 |
| 0.7506944444444444 | 137.347 |
| 0.751388888888889 | 128.284 |
| 0.7520833333333333 | 132.814 |
| 0.7527777777777778 | 128.284 |
| 0.7534722222222222 | 128.284 |
| 0.7541666666666668 | 123.758 |
| 0.7548611111111111 | 123.758 |
| 0.7555555555555555 | 119.235 |
| 0.75625 | 119.235 |
| 0.7569444444444445 | 119.235 |
| 0.7576388888888889 | 114.716 |
| 0.7583333333333333 | 114.716 |
| 0.7590277777777777 | 114.716 |
| 0.7597222222222223 | 114.716 |
| 0.7604166666666666 | 114.716 |
| 0.7611111111111111 | 92.184 |
| 0.7618055555555556 | 74.246 |
| 0.7625000000000001 | 78.722 |
| 0.7631944444444444 | 101.184 |
| 0.7638888888888888 | 110.201 |
| 0.7645833333333334 | 110.201 |
| 0.7652777777777778 | 110.201 |
| 0.7659722222222222 | 105.69 |
| 0.7666666666666666 | 101.184 |
| 0.7673611111111112 | 101.184 |
| 0.7680555555555556 | 101.184 |
| 0.7687499999999999 | 96.682 |
| 0.7694444444444444 | 87.692 |
| 0.7701388888888889 | 96.682 |
| 0.7708333333333334 | 96.682 |
| 0.7715277777777777 | 96.682 |
| 0.7722222222222223 | 96.682 |
| 0.7729166666666667 | 92.184 |
| 0.7736111111111111 | 92.184 |
| 0.7743055555555555 | 92.184 |
| 0.775 | 92.184 |
| 0.7756944444444445 | 92.184 |
| 0.7763888888888889 | 92.184 |
| 0.7770833333333332 | 92.184 |
| 0.7777777777777778 | 92.184 |
| 0.7784722222222222 | 92.184 |
| 0.7791666666666667 | 92.184 |
| 0.779861111111111 | 87.692 |
| 0.7805555555555556 | 87.692 |
| 0.78125 | 87.692 |
| 0.7819444444444444 | 87.692 |
| 0.782638888888889 | 87.692 |
| 0.7833333333333333 | 87.692 |
| 0.7840277777777778 | 83.205 |
| 0.7847222222222222 | 83.205 |
| 0.7854166666666668 | 83.205 |
| 0.7861111111111111 | 83.205 |
| 0.7868055555555555 | 78.722 |
| 0.7875 | 78.722 |
| 0.7881944444444445 | 74.246 |
| 0.7888888888888889 | 74.246 |
| 0.7895833333333333 | 74.246 |
| 0.7902777777777777 | 74.246 |
| 0.7909722222222223 | 74.246 |
| 0.7916666666666666 | 74.246 |
| 0.7923611111111111 | 74.246 |
| 0.7930555555555556 | 74.246 |
| 0.7937500000000001 | 74.246 |
| 0.7944444444444444 | 74.246 |
| 0.7951388888888888 | 69.775 |
| 0.7958333333333334 | 69.775 |
| 0.7965277777777778 | 69.775 |
| 0.7972222222222222 | 69.775 |
| 0.7979166666666666 | 65.31 |
| 0.7986111111111112 | 65.31 |
| 0.7993055555555556 | 65.31 |
| 0.7999999999999999 | 65.31 |
| 0.8006944444444444 | 65.31 |
| 0.8013888888888889 | 60.85 |
| 0.8020833333333334 | 60.85 |
| 0.8027777777777777 | 60.85 |
| 0.8034722222222223 | 56.398 |
| 0.8041666666666667 | 56.398 |
| 0.8048611111111111 | 56.398 |
| 0.8055555555555555 | 56.398 |
| 0.80625 | 51.951 |
| 0.8069444444444445 | 51.951 |
| 0.8076388888888889 | 51.951 |
| 0.8083333333333332 | 51.951 |
| 0.8090277777777778 | 51.951 |
| 0.8097222222222222 | 51.951 |
| 0.8104166666666667 | 51.951 |
| 0.811111111111111 | 51.951 |
| 0.8118055555555556 | 47.511 |
| 0.8125 | 47.511 |
| 0.8131944444444444 | 47.511 |
| 0.813888888888889 | 47.511 |
| 0.8145833333333333 | 47.511 |
| 0.8152777777777778 | 47.511 |
| 0.8159722222222222 | 43.079 |
| 0.8166666666666668 | 43.079 |
| 0.8173611111111111 | 43.079 |
| 0.8180555555555555 | 43.079 |
| 0.81875 | 38.653 |
| 0.8194444444444445 | 38.653 |
| 0.8201388888888889 | 38.653 |
| 0.8208333333333333 | 38.653 |
| 0.8215277777777777 | 38.653 |
| 0.8222222222222223 | 38.653 |
| 0.8229166666666666 | 34.234 |
| 0.8236111111111111 | 34.234 |
| 0.8243055555555556 | 34.234 |
| 0.8250000000000001 | 34.234 |
| 0.8256944444444444 | 34.234 |
| 0.8263888888888888 | 29.823 |
| 0.8270833333333334 | 29.823 |
| 0.8277777777777778 | 29.823 |
| 0.8284722222222222 | 29.823 |
| 0.8291666666666666 | 25.419 |
| 0.8298611111111112 | 25.419 |
| 0.8305555555555556 | 25.419 |
| 0.8312499999999999 | 25.419 |
| 0.8319444444444444 | 25.419 |
| 0.8326388888888889 | 21.024 |
| 0.8333333333333334 | 21.024 |
| 0.8340277777777777 | 21.024 |
| 0.8347222222222223 | 21.024 |
| 0.8354166666666667 | 21.024 |
| 0.8361111111111111 | 16.636 |
| 0.8368055555555555 | 16.636 |
| 0.8375 | 16.636 |
| 0.8381944444444445 | 16.636 |
| 0.8388888888888889 | 16.636 |
| 0.8395833333333332 | 16.636 |
| 0.8402777777777778 | 12.257 |
| 0.8409722222222222 | 12.257 |
| 0.8416666666666667 | 12.257 |
| 0.842361111111111 | 12.257 |
| 0.8430555555555556 | 12.257 |
| 0.84375 | 12.257 |
| 0.8444444444444444 | 7.887 |
| 0.845138888888889 | 7.887 |
| 0.8458333333333333 | 7.887 |
| 0.8465277777777778 | 7.887 |
| 0.8472222222222222 | 7.887 |
| 0.8479166666666668 | 3.525 |
| 0.8486111111111111 | 3.525 |
| 0.8493055555555555 | 3.525 |
| 0.85 | 3.525 |
| 0.8506944444444445 | 3.525 |
| 0.8513888888888889 | 3.525 |
| 0.8520833333333333 | 3.525 |
| 0.8527777777777777 | 3.525 |
| 0.8534722222222223 | 3.525 |
| 0.8541666666666666 | 0 |
| 0.8548611111111111 | 0 |
| 0.8555555555555556 | 0 |
| 0.8562500000000001 | 0 |
| 0.8569444444444444 | 0 |
| 0.8576388888888888 | 0 |
| 0.8583333333333334 | 0 |
| 0.8590277777777778 | 0 |
| 0.8597222222222222 | 0 |
| 0.8604166666666666 | 0 |
| 0.8611111111111112 | 0 |
| 0.8618055555555556 | 0 |
| 0.8624999999999999 | 0 |
| 0.8631944444444444 | 0 |
| 0.8638888888888889 | 0 |
| 0.8645833333333334 | 0 |
| 0.8652777777777777 | 0 |
| 0.8659722222222223 | 0 |
| 0.8666666666666667 | 0 |
| 0.8673611111111111 | 0 |
| 0.8680555555555555 | 0 |
| 0.86875 | 0 |
| 0.8694444444444445 | 0 |
| 0.8701388888888889 | 0 |
| 0.8708333333333332 | 0 |
| 0.8715277777777778 | 0 |
| 0.8722222222222222 | 0 |
| 0.8729166666666667 | 0 |
| 0.873611111111111 | 0 |
| 0.8743055555555556 | 0 |
| 0.875 | 0 |
| 0.8756944444444444 | 0 |
| 0.876388888888889 | 0 |
| 0.8770833333333333 | 0 |
| 0.8777777777777778 | 0 |
| 0.8784722222222222 | 0 |
| 0.8791666666666668 | 0 |
| 0.8798611111111111 | 0 |
| 0.8805555555555555 | 0 |
| 0.88125 | 0 |
| 0.8819444444444445 | 0 |
| 0.8826388888888889 | 0 |
| 0.8833333333333333 | 0 |
| 0.8840277777777777 | 0 |
| 0.8847222222222223 | 0 |
| 0.8854166666666666 | 0 |
| 0.8861111111111111 | 0 |
| 0.8868055555555556 | 0 |
| 0.8875000000000001 | 0 |
| 0.8881944444444444 | 0 |
| 0.8888888888888888 | 0 |
| 0.8895833333333334 | 0 |
| 0.8902777777777778 | 0 |
| 0.8909722222222222 | 0 |
| 0.8916666666666666 | 0 |
| 0.8923611111111112 | 0 |
| 0.8930555555555556 | 0 |
| 0.8937499999999999 | 0 |
| 0.8944444444444444 | 0 |
| 0.8951388888888889 | 0 |
| 0.8958333333333334 | 0 |
| 0.8965277777777777 | 0 |
| 0.8972222222222223 | 0 |
| 0.8979166666666667 | 0 |
| 0.8986111111111111 | 0 |
| 0.8993055555555555 | 0 |
| 0.9 | 0 |
| 0.9006944444444445 | 0 |
| 0.9013888888888889 | 0 |
| 0.9020833333333332 | 0 |
| 0.9027777777777778 | 0 |
| 0.9034722222222222 | 0 |
| 0.9041666666666667 | 0 |
| 0.904861111111111 | 0 |
| 0.9055555555555556 | 0 |
| 0.90625 | 0 |
| 0.9069444444444444 | 0 |
| 0.907638888888889 | 0 |
| 0.9083333333333333 | 0 |
| 0.9090277777777778 | 0 |
| 0.9097222222222222 | 0 |
| 0.9104166666666668 | 0 |
| 0.9111111111111111 | 0 |
| 0.9118055555555555 | 0 |
| 0.9125 | 0 |
| 0.9131944444444445 | 0 |
| 0.9138888888888889 | 0 |
| 0.9145833333333333 | 0 |
| 0.9152777777777777 | 0 |
| 0.9159722222222223 | 0 |
| 0.9166666666666666 | 0 |
| 0.9173611111111111 | 0 |
| 0.9180555555555556 | 0 |
| 0.9187500000000001 | 0 |
| 0.9194444444444444 | 0 |
| 0.9201388888888888 | 0 |
| 0.9208333333333334 | 0 |
| 0.9215277777777778 | 0 |
| 0.9222222222222222 | 0 |
| 0.9229166666666666 | 0 |
| 0.9236111111111112 | 0 |
| 0.9243055555555556 | 0 |
| 0.9249999999999999 | 0 |
| 0.9256944444444444 | 0 |
| 0.9263888888888889 | 0 |
| 0.9270833333333334 | 0 |
| 0.9277777777777777 | 0 |
| 0.9284722222222223 | 0 |
| 0.9291666666666667 | 0 |
| 0.9298611111111111 | 0 |
| 0.9305555555555555 | 0 |
| 0.93125 | 0 |
| 0.9319444444444445 | 0 |
| 0.9326388888888889 | 0 |
| 0.9333333333333332 | 0 |
| 0.9340277777777778 | 0 |
| 0.9347222222222222 | 0 |
| 0.9354166666666667 | 0 |
| 0.936111111111111 | 0 |
| 0.9368055555555556 | 0 |
| 0.9375 | 0 |
| 0.9381944444444444 | 0 |
| 0.938888888888889 | 0 |
| 0.9395833333333333 | 0 |
| 0.9402777777777778 | 0 |
| 0.9409722222222222 | 0 |
| 0.9416666666666668 | 0 |
| 0.9423611111111111 | 0 |
| 0.9430555555555555 | 0 |
| 0.94375 | 0 |
| 0.9444444444444445 | 0 |
| 0.9451388888888889 | 0 |
| 0.9458333333333333 | 0 |
| 0.9465277777777777 | 0 |
| 0.9472222222222223 | 0 |
| 0.9479166666666666 | 0 |
| 0.9486111111111111 | 0 |
| 0.9493055555555556 | 0 |
| 0.9500000000000001 | 0 |
| 0.9506944444444444 | 0 |
| 0.9513888888888888 | 0 |
| 0.9520833333333334 | 0 |
| 0.9527777777777778 | 0 |
| 0.9534722222222222 | 0 |
| 0.9541666666666666 | 0 |
| 0.9548611111111112 | 0 |
| 0.9555555555555556 | 0 |
| 0.9562499999999999 | 0 |
| 0.9569444444444444 | 0 |
| 0.9576388888888889 | 0 |
| 0.9583333333333334 | 0 |
| 0.9590277777777777 | 0 |
| 0.9597222222222223 | 0 |
| 0.9604166666666667 | 0 |
| 0.9611111111111111 | 0 |
| 0.9618055555555555 | 0 |
| 0.9625 | 0 |
| 0.9631944444444445 | 0 |
| 0.9638888888888889 | 0 |
| 0.9645833333333332 | 0 |
| 0.9652777777777778 | 0 |
| 0.9659722222222222 | 0 |
| 0.9666666666666667 | 0 |
| 0.967361111111111 | 0 |
| 0.9680555555555556 | 0 |
| 0.96875 | 0 |
| 0.9694444444444444 | 0 |
| 0.970138888888889 | 0 |
| 0.9708333333333333 | 0 |
| 0.9715277777777778 | 0 |
| 0.9722222222222222 | 0 |
| 0.9729166666666668 | 0 |
| 0.9736111111111111 | 0 |
| 0.9743055555555555 | 0 |
| 0.975 | 0 |
| 0.9756944444444445 | 0 |
| 0.9763888888888889 | 0 |
| 0.9770833333333333 | 0 |
| 0.9777777777777777 | 0 |
| 0.9784722222222223 | 0 |
| 0.9791666666666666 | 0 |
| 0.9798611111111111 | 0 |
| 0.9805555555555556 | 0 |
| 0.9812500000000001 | 0 |
| 0.9819444444444444 | 0 |
| 0.9826388888888888 | 0 |
| 0.9833333333333334 | 0 |
| 0.9840277777777778 | 0 |
| 0.9847222222222222 | 0 |
| 0.9854166666666666 | 0 |
| 0.9861111111111112 | 0 |
| 0.9868055555555556 | 0 |
| 0.9874999999999999 | 0 |
| 0.9881944444444444 | 0 |
| 0.9888888888888889 | 0 |
| 0.9895833333333334 | 0 |
| 0.9902777777777777 | 0 |
| 0.9909722222222223 | 0 |
| 0.9916666666666667 | 0 |
| 0.9923611111111111 | 0 |
| 0.9930555555555555 | 0 |
| 0.99375 | 0 |
| 0.9944444444444445 | 0 |
| 0.9951388888888889 | 0 |
| 0.9958333333333332 | 0 |
| 0.9965277777777778 | 0 |
| 0.9972222222222222 | 0 |
| 0.9979166666666667 | 0 |
| 0.998611111111111 | 0 |
| 0.9993055555555556 | 0 |